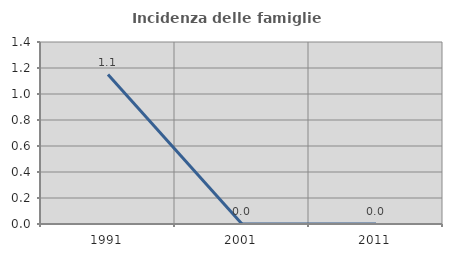
| Category | Incidenza delle famiglie numerose |
|---|---|
| 1991.0 | 1.149 |
| 2001.0 | 0 |
| 2011.0 | 0 |